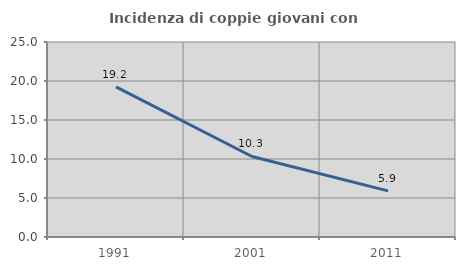
| Category | Incidenza di coppie giovani con figli |
|---|---|
| 1991.0 | 19.237 |
| 2001.0 | 10.325 |
| 2011.0 | 5.913 |